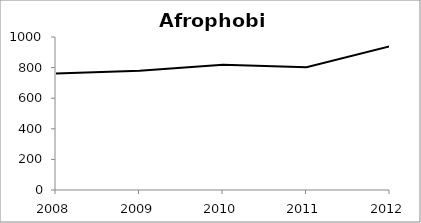
| Category | Series 0 |
|---|---|
| 2008.0 | 761 |
| 2009.0 | 780 |
| 2010.0 | 818 |
| 2011.0 | 803 |
| 2012.0 | 940 |